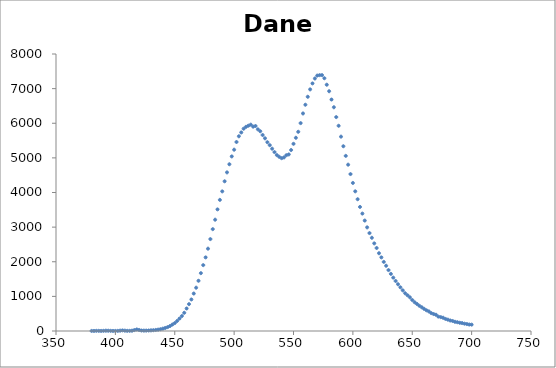
| Category | Dane |
|---|---|
| 380.0 | 2.096 |
| 382.0 | 2.317 |
| 384.0 | 4.534 |
| 386.0 | 4.126 |
| 388.0 | 2.477 |
| 390.0 | 4.662 |
| 392.0 | 9.179 |
| 394.0 | 7.641 |
| 396.0 | 4.408 |
| 398.0 | 2.715 |
| 400.0 | 2.362 |
| 402.0 | 3.509 |
| 404.0 | 9.739 |
| 406.0 | 17.403 |
| 408.0 | 9.863 |
| 410.0 | 4.509 |
| 412.0 | 4.663 |
| 414.0 | 8.634 |
| 416.0 | 26.864 |
| 418.0 | 44.44 |
| 420.0 | 29.883 |
| 422.0 | 13.714 |
| 424.0 | 10.954 |
| 426.0 | 11.635 |
| 428.0 | 14.414 |
| 430.0 | 19.06 |
| 432.0 | 23.65 |
| 434.0 | 30.723 |
| 436.0 | 39.05 |
| 438.0 | 52.303 |
| 440.0 | 68.351 |
| 442.0 | 87.54 |
| 444.0 | 112.414 |
| 446.0 | 143.449 |
| 448.0 | 185.49 |
| 450.0 | 228.998 |
| 452.0 | 289.262 |
| 454.0 | 359.165 |
| 456.0 | 431.767 |
| 458.0 | 525.675 |
| 460.0 | 650.135 |
| 462.0 | 775.851 |
| 464.0 | 910.681 |
| 466.0 | 1081.652 |
| 468.0 | 1251.095 |
| 470.0 | 1450.174 |
| 472.0 | 1670.789 |
| 474.0 | 1902.713 |
| 476.0 | 2126.109 |
| 478.0 | 2377.957 |
| 480.0 | 2654.602 |
| 482.0 | 2941.724 |
| 484.0 | 3214.735 |
| 486.0 | 3512.712 |
| 488.0 | 3787.056 |
| 490.0 | 4032.335 |
| 492.0 | 4323.623 |
| 494.0 | 4580.572 |
| 496.0 | 4816.192 |
| 498.0 | 5041.965 |
| 500.0 | 5236.382 |
| 502.0 | 5458.779 |
| 504.0 | 5623.654 |
| 506.0 | 5734.232 |
| 508.0 | 5842.592 |
| 510.0 | 5896.15 |
| 512.0 | 5929.396 |
| 514.0 | 5959.254 |
| 516.0 | 5902.237 |
| 518.0 | 5920.891 |
| 520.0 | 5824.235 |
| 522.0 | 5769.08 |
| 524.0 | 5660.384 |
| 526.0 | 5564.489 |
| 528.0 | 5452.299 |
| 530.0 | 5366.638 |
| 532.0 | 5265.422 |
| 534.0 | 5166.949 |
| 536.0 | 5079.93 |
| 538.0 | 5029.852 |
| 540.0 | 4991.279 |
| 542.0 | 5013.345 |
| 544.0 | 5077.521 |
| 546.0 | 5099.325 |
| 548.0 | 5226.76 |
| 550.0 | 5405.481 |
| 552.0 | 5580.444 |
| 554.0 | 5753.415 |
| 556.0 | 6003.863 |
| 558.0 | 6282.52 |
| 560.0 | 6534.697 |
| 562.0 | 6764.511 |
| 564.0 | 6978.007 |
| 566.0 | 7150.339 |
| 568.0 | 7292.229 |
| 570.0 | 7377.143 |
| 572.0 | 7389.507 |
| 574.0 | 7390.221 |
| 576.0 | 7300.376 |
| 578.0 | 7112.906 |
| 580.0 | 6924.723 |
| 582.0 | 6684.644 |
| 584.0 | 6461.682 |
| 586.0 | 6178.104 |
| 588.0 | 5926.759 |
| 590.0 | 5613.276 |
| 592.0 | 5336.225 |
| 594.0 | 5057.639 |
| 596.0 | 4803.82 |
| 598.0 | 4532.18 |
| 600.0 | 4275.6 |
| 602.0 | 4033.661 |
| 604.0 | 3805.736 |
| 606.0 | 3583.61 |
| 608.0 | 3391.047 |
| 610.0 | 3189.62 |
| 612.0 | 2992.881 |
| 614.0 | 2827.857 |
| 616.0 | 2692.818 |
| 618.0 | 2530.574 |
| 620.0 | 2397.057 |
| 622.0 | 2245.84 |
| 624.0 | 2126.33 |
| 626.0 | 1995.673 |
| 628.0 | 1884.546 |
| 630.0 | 1759.574 |
| 632.0 | 1649.73 |
| 634.0 | 1541.307 |
| 636.0 | 1444.559 |
| 638.0 | 1350.552 |
| 640.0 | 1261.572 |
| 642.0 | 1174.354 |
| 644.0 | 1089.849 |
| 646.0 | 1032.301 |
| 648.0 | 973.067 |
| 650.0 | 895.468 |
| 652.0 | 829.566 |
| 654.0 | 780.398 |
| 656.0 | 728.339 |
| 658.0 | 685.025 |
| 660.0 | 639.365 |
| 662.0 | 597.763 |
| 664.0 | 565.103 |
| 666.0 | 517.272 |
| 668.0 | 489.35 |
| 670.0 | 468.578 |
| 672.0 | 415.329 |
| 674.0 | 400.938 |
| 676.0 | 382.816 |
| 678.0 | 348.449 |
| 680.0 | 327.044 |
| 682.0 | 303.885 |
| 684.0 | 288.854 |
| 686.0 | 265.583 |
| 688.0 | 254.195 |
| 690.0 | 237.468 |
| 692.0 | 229.147 |
| 694.0 | 211.652 |
| 696.0 | 200.444 |
| 698.0 | 186.897 |
| 700.0 | 184.046 |